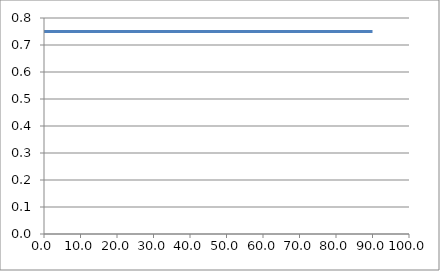
| Category | Elevation (in.) |
|---|---|
| 0.024 | 0.75 |
| 3.024 | 0.75 |
| 6.024 | 0.75 |
| 9.024000000000001 | 0.75 |
| 12.024000000000001 | 0.75 |
| 15.024000000000001 | 0.75 |
| 18.024 | 0.75 |
| 21.024 | 0.75 |
| 24.023999999999997 | 0.75 |
| 27.023999999999997 | 0.75 |
| 30.023999999999997 | 0.75 |
| 33.024 | 0.75 |
| 36.024 | 0.75 |
| 39.024 | 0.75 |
| 42.024 | 0.75 |
| 45.024 | 0.75 |
| 48.024 | 0.75 |
| 51.024 | 0.75 |
| 54.024 | 0.75 |
| 57.024 | 0.75 |
| 60.024 | 0.75 |
| 63.024 | 0.75 |
| 66.024 | 0.75 |
| 69.024 | 0.75 |
| 72.024 | 0.75 |
| 75.024 | 0.75 |
| 78.024 | 0.75 |
| 81.024 | 0.75 |
| 84.024 | 0.75 |
| 87.024 | 0.75 |
| 90.024 | 0.75 |